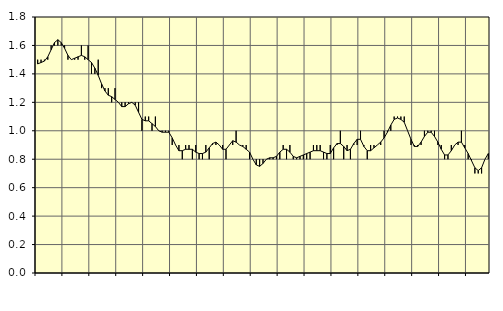
| Category | Piggar | Jordbruk, skogsbruk o fiske, SNI 01-03 |
|---|---|---|
| nan | 1.5 | 1.47 |
| 87.0 | 1.5 | 1.48 |
| 87.0 | 1.5 | 1.49 |
| 87.0 | 1.5 | 1.52 |
| nan | 1.6 | 1.57 |
| 88.0 | 1.6 | 1.62 |
| 88.0 | 1.6 | 1.64 |
| 88.0 | 1.6 | 1.62 |
| nan | 1.6 | 1.58 |
| 89.0 | 1.5 | 1.53 |
| 89.0 | 1.5 | 1.5 |
| 89.0 | 1.5 | 1.51 |
| nan | 1.5 | 1.52 |
| 90.0 | 1.6 | 1.53 |
| 90.0 | 1.5 | 1.52 |
| 90.0 | 1.6 | 1.5 |
| nan | 1.4 | 1.48 |
| 91.0 | 1.4 | 1.44 |
| 91.0 | 1.5 | 1.39 |
| 91.0 | 1.3 | 1.33 |
| nan | 1.3 | 1.28 |
| 92.0 | 1.3 | 1.25 |
| 92.0 | 1.2 | 1.24 |
| 92.0 | 1.3 | 1.22 |
| nan | 1.2 | 1.2 |
| 93.0 | 1.2 | 1.17 |
| 93.0 | 1.2 | 1.17 |
| 93.0 | 1.2 | 1.19 |
| nan | 1.2 | 1.2 |
| 94.0 | 1.2 | 1.18 |
| 94.0 | 1.2 | 1.13 |
| 94.0 | 1 | 1.08 |
| nan | 1.1 | 1.07 |
| 95.0 | 1.1 | 1.07 |
| 95.0 | 1 | 1.05 |
| 95.0 | 1.1 | 1.03 |
| nan | 1 | 1 |
| 96.0 | 1 | 0.99 |
| 96.0 | 1 | 0.99 |
| 96.0 | 1 | 0.99 |
| nan | 0.9 | 0.95 |
| 97.0 | 0.9 | 0.9 |
| 97.0 | 0.9 | 0.86 |
| 97.0 | 0.8 | 0.86 |
| nan | 0.9 | 0.87 |
| 98.0 | 0.9 | 0.87 |
| 98.0 | 0.8 | 0.87 |
| 98.0 | 0.9 | 0.85 |
| nan | 0.8 | 0.84 |
| 99.0 | 0.8 | 0.84 |
| 99.0 | 0.9 | 0.85 |
| 99.0 | 0.8 | 0.88 |
| nan | 0.9 | 0.91 |
| 0.0 | 0.9 | 0.92 |
| 0.0 | 0.9 | 0.9 |
| 0.0 | 0.9 | 0.87 |
| nan | 0.8 | 0.87 |
| 1.0 | 0.9 | 0.9 |
| 1.0 | 0.9 | 0.93 |
| 1.0 | 1 | 0.92 |
| nan | 0.9 | 0.9 |
| 2.0 | 0.9 | 0.89 |
| 2.0 | 0.9 | 0.87 |
| 2.0 | 0.8 | 0.85 |
| nan | 0.8 | 0.8 |
| 3.0 | 0.8 | 0.76 |
| 3.0 | 0.8 | 0.75 |
| 3.0 | 0.8 | 0.77 |
| nan | 0.8 | 0.8 |
| 4.0 | 0.8 | 0.81 |
| 4.0 | 0.8 | 0.81 |
| 4.0 | 0.8 | 0.82 |
| nan | 0.8 | 0.85 |
| 5.0 | 0.9 | 0.87 |
| 5.0 | 0.8 | 0.87 |
| 5.0 | 0.9 | 0.85 |
| nan | 0.8 | 0.82 |
| 6.0 | 0.8 | 0.81 |
| 6.0 | 0.8 | 0.82 |
| 6.0 | 0.8 | 0.83 |
| nan | 0.8 | 0.84 |
| 7.0 | 0.8 | 0.85 |
| 7.0 | 0.9 | 0.86 |
| 7.0 | 0.9 | 0.86 |
| nan | 0.9 | 0.86 |
| 8.0 | 0.8 | 0.85 |
| 8.0 | 0.8 | 0.84 |
| 8.0 | 0.9 | 0.84 |
| nan | 0.8 | 0.88 |
| 9.0 | 0.9 | 0.91 |
| 9.0 | 1 | 0.91 |
| 9.0 | 0.8 | 0.89 |
| nan | 0.9 | 0.86 |
| 10.0 | 0.8 | 0.87 |
| 10.0 | 0.9 | 0.91 |
| 10.0 | 0.9 | 0.94 |
| nan | 1 | 0.94 |
| 11.0 | 0.9 | 0.89 |
| 11.0 | 0.8 | 0.86 |
| 11.0 | 0.9 | 0.86 |
| nan | 0.9 | 0.88 |
| 12.0 | 0.9 | 0.9 |
| 12.0 | 0.9 | 0.92 |
| 12.0 | 1 | 0.95 |
| nan | 1 | 0.99 |
| 13.0 | 1 | 1.04 |
| 13.0 | 1.1 | 1.08 |
| 13.0 | 1.1 | 1.09 |
| nan | 1.1 | 1.08 |
| 14.0 | 1.1 | 1.06 |
| 14.0 | 1 | 1 |
| 14.0 | 0.9 | 0.94 |
| nan | 0.9 | 0.89 |
| 15.0 | 0.9 | 0.89 |
| 15.0 | 0.9 | 0.92 |
| 15.0 | 1 | 0.96 |
| nan | 1 | 0.99 |
| 16.0 | 1 | 0.99 |
| 16.0 | 1 | 0.96 |
| 16.0 | 0.9 | 0.92 |
| nan | 0.9 | 0.87 |
| 17.0 | 0.8 | 0.83 |
| 17.0 | 0.8 | 0.83 |
| 17.0 | 0.9 | 0.86 |
| nan | 0.9 | 0.9 |
| 18.0 | 0.9 | 0.92 |
| 18.0 | 1 | 0.92 |
| 18.0 | 0.9 | 0.88 |
| nan | 0.8 | 0.84 |
| 19.0 | 0.8 | 0.79 |
| 19.0 | 0.7 | 0.74 |
| 19.0 | 0.7 | 0.72 |
| nan | 0.7 | 0.74 |
| 20.0 | 0.8 | 0.8 |
| 20.0 | 0.8 | 0.84 |